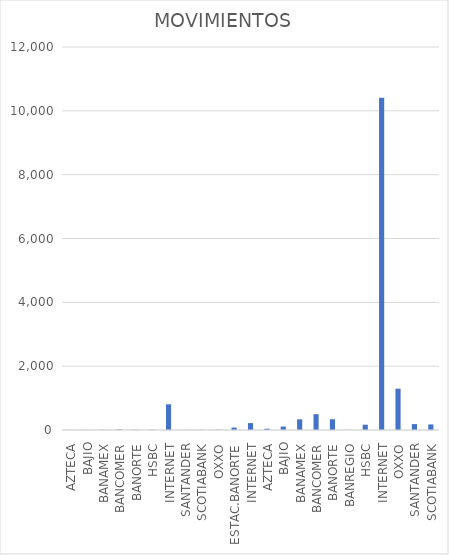
| Category | MOVIMIENTOS |
|---|---|
| AZTECA | 3 |
| BAJIO | 2 |
| BANAMEX | 5 |
| BANCOMER | 17 |
| BANORTE | 5 |
| HSBC | 7 |
| INTERNET | 805 |
| SANTANDER | 3 |
| SCOTIABANK | 5 |
| OXXO | 9 |
| ESTAC.BANORTE | 76 |
| INTERNET | 217 |
| AZTECA | 41 |
| BAJIO | 108 |
| BANAMEX | 334 |
| BANCOMER | 495 |
| BANORTE | 337 |
| BANREGIO | 4 |
| HSBC | 166 |
| INTERNET | 10407 |
| OXXO | 1295 |
| SANTANDER | 185 |
| SCOTIABANK | 174 |